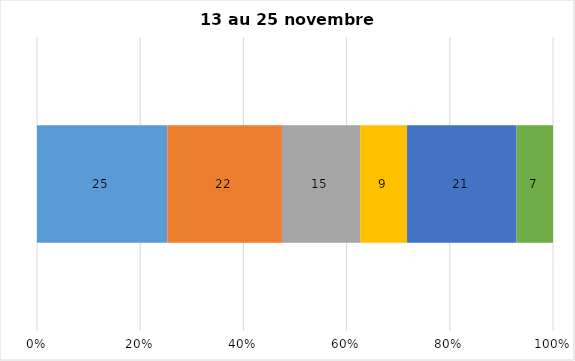
| Category | Plusieurs fois par jour | Une fois par jour | Quelques fois par semaine   | Une fois par semaine ou moins   |  Jamais   |  Je n’utilise pas les médias sociaux |
|---|---|---|---|---|---|---|
| 0 | 25 | 22 | 15 | 9 | 21 | 7 |